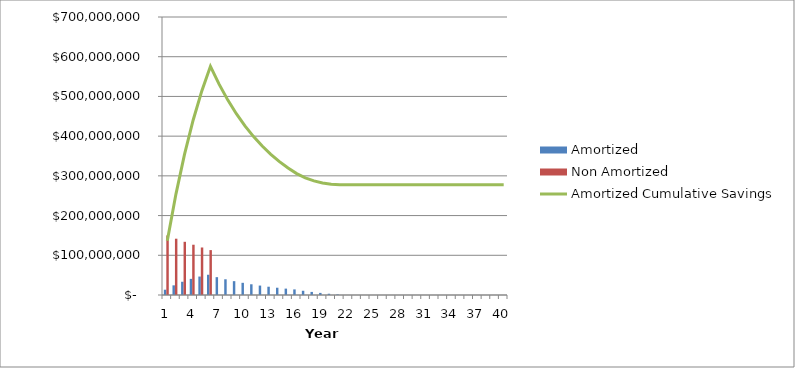
| Category | Amortized | Non Amortized |
|---|---|---|
| 0 | 13312500 | 150000000 |
| 1 | 24325312.5 | 141750000 |
| 2 | 33345295.313 | 133953750 |
| 3 | 40642029.07 | 126586293.75 |
| 4 | 46452143.721 | 119624047.594 |
| 5 | 50983155.817 | 113044724.976 |
| 6 | 44935951.207 | 0 |
| 7 | 39588355.96 | 0 |
| 8 | 34860920.251 | 0 |
| 9 | 30683088.124 | 0 |
| 10 | 26992213.22 | 0 |
| 11 | 23732682.415 | 0 |
| 12 | 20855135.64 | 0 |
| 13 | 18315771.395 | 0 |
| 14 | 16075728.643 | 0 |
| 15 | 14100536.727 | 0 |
| 16 | 10671061.261 | 0 |
| 17 | 7754267.714 | 0 |
| 18 | 5283685.885 | 0 |
| 19 | 3200915.369 | 0 |
| 20 | 1454681.65 | 0 |
| 21 | 0 | 0 |
| 22 | 0 | 0 |
| 23 | 0 | 0 |
| 24 | 0 | 0 |
| 25 | 0 | 0 |
| 26 | 0 | 0 |
| 27 | 0 | 0 |
| 28 | 0 | 0 |
| 29 | 0 | 0 |
| 30 | 0 | 0 |
| 31 | 0 | 0 |
| 32 | 0 | 0 |
| 33 | 0 | 0 |
| 34 | 0 | 0 |
| 35 | 0 | 0 |
| 36 | 0 | 0 |
| 37 | 0 | 0 |
| 38 | 0 | 0 |
| 39 | 0 | 0 |